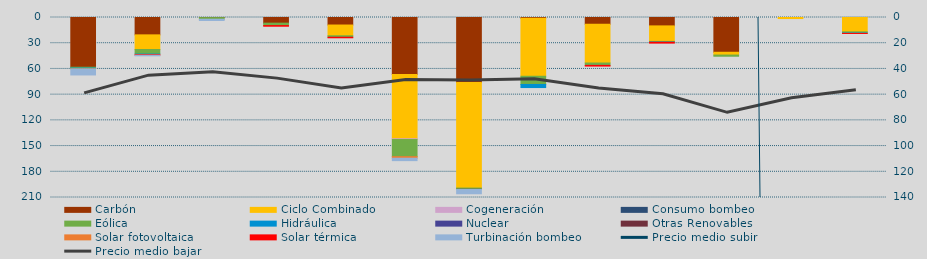
| Category | Carbón | Ciclo Combinado | Cogeneración | Consumo bombeo | Eólica | Hidráulica | Nuclear | Otras Renovables | Solar fotovoltaica | Solar térmica | Turbinación bombeo |
|---|---|---|---|---|---|---|---|---|---|---|---|
| 0 | 58033.7 | 0 | 0 |  | 988.1 | 1026.5 |  | 0 | 57.8 | 0 | 6933.6 |
| 1 | 20255.7 | 17094 | 0 |  | 5344.3 | 623 |  | 0 | 0 | 617.6 | 755.1 |
| 2 | 158.4 | 0 | 0 |  | 1844.3 | 12 |  | 0 | 0 | 0 | 1460 |
| 3 | 6575 | 0 | 0 |  | 2859 | 0 |  | 0 | 0 | 725.3 | 0 |
| 4 | 8771 | 12552 | 0 |  | 1652.9 | 70 |  | 0 | 0 | 608.7 | 0 |
| 5 | 66423 | 75034.9 | 910.1 |  | 19943.3 | 36 |  | 0 | 1820.4 | 0 | 2822.9 |
| 6 | 75870.4 | 123130.8 | 0 |  | 1278.3 | 0 |  | 288.4 | 0 | 0 | 5090.1 |
| 7 | 802.5 | 67762.6 | 0 |  | 9561.7 | 4762.5 |  | 0 | 0 | 0 | 0 |
| 8 | 7913 | 45184 | 0 |  | 2732.2 | 54.3 |  | 0 | 0 | 784 | 0 |
| 9 | 9798 | 18106.5 | 0 |  | 568.3 | 428.4 |  | 0 | 0 | 944 | 0 |
| 10 | 40570 | 3247 | 0 |  | 1377.6 | 0 |  | 0 | 0 | 0 | 0 |
| 11 | 0 | 1230 | 0 |  | 0 | 0 |  | 0 | 0 | 0 | 0 |
| 12 | 0 | 16736 | 0 |  | 1262.8 | 563.7 |  | 0 | 25.9 | 0.7 | 0 |